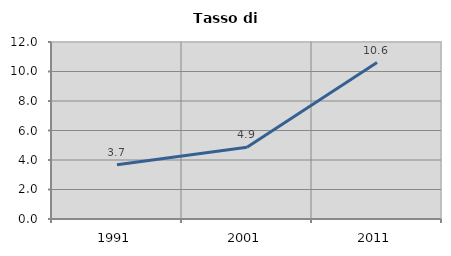
| Category | Tasso di disoccupazione   |
|---|---|
| 1991.0 | 3.676 |
| 2001.0 | 4.872 |
| 2011.0 | 10.602 |